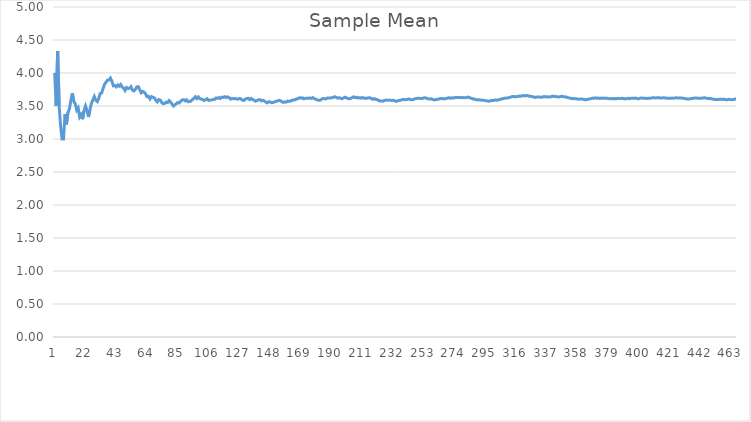
| Category | Series 0 |
|---|---|
| 0 | 4 |
| 1 | 3.5 |
| 2 | 4.333 |
| 3 | 3.5 |
| 4 | 3.2 |
| 5 | 3 |
| 6 | 3 |
| 7 | 3.375 |
| 8 | 3.222 |
| 9 | 3.4 |
| 10 | 3.455 |
| 11 | 3.583 |
| 12 | 3.692 |
| 13 | 3.571 |
| 14 | 3.533 |
| 15 | 3.438 |
| 16 | 3.471 |
| 17 | 3.333 |
| 18 | 3.368 |
| 19 | 3.3 |
| 20 | 3.429 |
| 21 | 3.5 |
| 22 | 3.435 |
| 23 | 3.333 |
| 24 | 3.44 |
| 25 | 3.538 |
| 26 | 3.593 |
| 27 | 3.643 |
| 28 | 3.586 |
| 29 | 3.567 |
| 30 | 3.613 |
| 31 | 3.688 |
| 32 | 3.697 |
| 33 | 3.765 |
| 34 | 3.829 |
| 35 | 3.861 |
| 36 | 3.892 |
| 37 | 3.895 |
| 38 | 3.923 |
| 39 | 3.875 |
| 40 | 3.805 |
| 41 | 3.81 |
| 42 | 3.791 |
| 43 | 3.818 |
| 44 | 3.8 |
| 45 | 3.826 |
| 46 | 3.787 |
| 47 | 3.771 |
| 48 | 3.735 |
| 49 | 3.78 |
| 50 | 3.765 |
| 51 | 3.769 |
| 52 | 3.792 |
| 53 | 3.741 |
| 54 | 3.727 |
| 55 | 3.75 |
| 56 | 3.789 |
| 57 | 3.793 |
| 58 | 3.746 |
| 59 | 3.7 |
| 60 | 3.721 |
| 61 | 3.71 |
| 62 | 3.683 |
| 63 | 3.641 |
| 64 | 3.646 |
| 65 | 3.606 |
| 66 | 3.642 |
| 67 | 3.632 |
| 68 | 3.623 |
| 69 | 3.586 |
| 70 | 3.563 |
| 71 | 3.597 |
| 72 | 3.589 |
| 73 | 3.554 |
| 74 | 3.533 |
| 75 | 3.539 |
| 76 | 3.558 |
| 77 | 3.551 |
| 78 | 3.582 |
| 79 | 3.562 |
| 80 | 3.531 |
| 81 | 3.5 |
| 82 | 3.518 |
| 83 | 3.536 |
| 84 | 3.553 |
| 85 | 3.547 |
| 86 | 3.575 |
| 87 | 3.591 |
| 88 | 3.596 |
| 89 | 3.578 |
| 90 | 3.593 |
| 91 | 3.565 |
| 92 | 3.57 |
| 93 | 3.574 |
| 94 | 3.6 |
| 95 | 3.615 |
| 96 | 3.639 |
| 97 | 3.612 |
| 98 | 3.636 |
| 99 | 3.61 |
| 100 | 3.604 |
| 101 | 3.598 |
| 102 | 3.583 |
| 103 | 3.596 |
| 104 | 3.61 |
| 105 | 3.585 |
| 106 | 3.589 |
| 107 | 3.593 |
| 108 | 3.596 |
| 109 | 3.6 |
| 110 | 3.622 |
| 111 | 3.616 |
| 112 | 3.628 |
| 113 | 3.614 |
| 114 | 3.635 |
| 115 | 3.629 |
| 116 | 3.641 |
| 117 | 3.627 |
| 118 | 3.639 |
| 119 | 3.625 |
| 120 | 3.603 |
| 121 | 3.615 |
| 122 | 3.61 |
| 123 | 3.613 |
| 124 | 3.608 |
| 125 | 3.603 |
| 126 | 3.614 |
| 127 | 3.609 |
| 128 | 3.589 |
| 129 | 3.585 |
| 130 | 3.603 |
| 131 | 3.614 |
| 132 | 3.617 |
| 133 | 3.597 |
| 134 | 3.615 |
| 135 | 3.596 |
| 136 | 3.591 |
| 137 | 3.572 |
| 138 | 3.583 |
| 139 | 3.593 |
| 140 | 3.596 |
| 141 | 3.577 |
| 142 | 3.587 |
| 143 | 3.576 |
| 144 | 3.559 |
| 145 | 3.548 |
| 146 | 3.565 |
| 147 | 3.561 |
| 148 | 3.55 |
| 149 | 3.553 |
| 150 | 3.563 |
| 151 | 3.572 |
| 152 | 3.575 |
| 153 | 3.584 |
| 154 | 3.581 |
| 155 | 3.564 |
| 156 | 3.554 |
| 157 | 3.563 |
| 158 | 3.56 |
| 159 | 3.575 |
| 160 | 3.571 |
| 161 | 3.574 |
| 162 | 3.589 |
| 163 | 3.591 |
| 164 | 3.594 |
| 165 | 3.608 |
| 166 | 3.611 |
| 167 | 3.625 |
| 168 | 3.621 |
| 169 | 3.624 |
| 170 | 3.608 |
| 171 | 3.616 |
| 172 | 3.618 |
| 173 | 3.615 |
| 174 | 3.623 |
| 175 | 3.614 |
| 176 | 3.627 |
| 177 | 3.612 |
| 178 | 3.603 |
| 179 | 3.594 |
| 180 | 3.586 |
| 181 | 3.588 |
| 182 | 3.601 |
| 183 | 3.614 |
| 184 | 3.611 |
| 185 | 3.608 |
| 186 | 3.62 |
| 187 | 3.622 |
| 188 | 3.619 |
| 189 | 3.626 |
| 190 | 3.628 |
| 191 | 3.641 |
| 192 | 3.632 |
| 193 | 3.619 |
| 194 | 3.626 |
| 195 | 3.617 |
| 196 | 3.609 |
| 197 | 3.621 |
| 198 | 3.633 |
| 199 | 3.625 |
| 200 | 3.612 |
| 201 | 3.609 |
| 202 | 3.616 |
| 203 | 3.627 |
| 204 | 3.639 |
| 205 | 3.626 |
| 206 | 3.633 |
| 207 | 3.62 |
| 208 | 3.627 |
| 209 | 3.619 |
| 210 | 3.63 |
| 211 | 3.618 |
| 212 | 3.62 |
| 213 | 3.617 |
| 214 | 3.623 |
| 215 | 3.625 |
| 216 | 3.613 |
| 217 | 3.601 |
| 218 | 3.612 |
| 219 | 3.6 |
| 220 | 3.597 |
| 221 | 3.586 |
| 222 | 3.574 |
| 223 | 3.576 |
| 224 | 3.573 |
| 225 | 3.584 |
| 226 | 3.59 |
| 227 | 3.588 |
| 228 | 3.59 |
| 229 | 3.587 |
| 230 | 3.584 |
| 231 | 3.586 |
| 232 | 3.579 |
| 233 | 3.568 |
| 234 | 3.579 |
| 235 | 3.585 |
| 236 | 3.586 |
| 237 | 3.597 |
| 238 | 3.598 |
| 239 | 3.596 |
| 240 | 3.598 |
| 241 | 3.603 |
| 242 | 3.605 |
| 243 | 3.594 |
| 244 | 3.596 |
| 245 | 3.602 |
| 246 | 3.611 |
| 247 | 3.613 |
| 248 | 3.618 |
| 249 | 3.616 |
| 250 | 3.614 |
| 251 | 3.615 |
| 252 | 3.625 |
| 253 | 3.622 |
| 254 | 3.616 |
| 255 | 3.605 |
| 256 | 3.607 |
| 257 | 3.609 |
| 258 | 3.598 |
| 259 | 3.592 |
| 260 | 3.598 |
| 261 | 3.599 |
| 262 | 3.605 |
| 263 | 3.614 |
| 264 | 3.611 |
| 265 | 3.613 |
| 266 | 3.607 |
| 267 | 3.616 |
| 268 | 3.617 |
| 269 | 3.626 |
| 270 | 3.616 |
| 271 | 3.625 |
| 272 | 3.619 |
| 273 | 3.628 |
| 274 | 3.629 |
| 275 | 3.63 |
| 276 | 3.628 |
| 277 | 3.626 |
| 278 | 3.631 |
| 279 | 3.625 |
| 280 | 3.626 |
| 281 | 3.628 |
| 282 | 3.636 |
| 283 | 3.627 |
| 284 | 3.618 |
| 285 | 3.612 |
| 286 | 3.603 |
| 287 | 3.601 |
| 288 | 3.592 |
| 289 | 3.597 |
| 290 | 3.591 |
| 291 | 3.589 |
| 292 | 3.587 |
| 293 | 3.588 |
| 294 | 3.58 |
| 295 | 3.578 |
| 296 | 3.572 |
| 297 | 3.577 |
| 298 | 3.582 |
| 299 | 3.583 |
| 300 | 3.588 |
| 301 | 3.593 |
| 302 | 3.587 |
| 303 | 3.595 |
| 304 | 3.6 |
| 305 | 3.608 |
| 306 | 3.612 |
| 307 | 3.617 |
| 308 | 3.621 |
| 309 | 3.623 |
| 310 | 3.627 |
| 311 | 3.635 |
| 312 | 3.642 |
| 313 | 3.643 |
| 314 | 3.638 |
| 315 | 3.646 |
| 316 | 3.644 |
| 317 | 3.651 |
| 318 | 3.649 |
| 319 | 3.653 |
| 320 | 3.66 |
| 321 | 3.652 |
| 322 | 3.659 |
| 323 | 3.654 |
| 324 | 3.646 |
| 325 | 3.647 |
| 326 | 3.639 |
| 327 | 3.637 |
| 328 | 3.629 |
| 329 | 3.636 |
| 330 | 3.634 |
| 331 | 3.636 |
| 332 | 3.631 |
| 333 | 3.638 |
| 334 | 3.645 |
| 335 | 3.637 |
| 336 | 3.641 |
| 337 | 3.636 |
| 338 | 3.637 |
| 339 | 3.644 |
| 340 | 3.648 |
| 341 | 3.643 |
| 342 | 3.644 |
| 343 | 3.637 |
| 344 | 3.638 |
| 345 | 3.642 |
| 346 | 3.648 |
| 347 | 3.641 |
| 348 | 3.642 |
| 349 | 3.634 |
| 350 | 3.627 |
| 351 | 3.622 |
| 352 | 3.618 |
| 353 | 3.61 |
| 354 | 3.614 |
| 355 | 3.61 |
| 356 | 3.611 |
| 357 | 3.603 |
| 358 | 3.604 |
| 359 | 3.606 |
| 360 | 3.604 |
| 361 | 3.599 |
| 362 | 3.592 |
| 363 | 3.599 |
| 364 | 3.603 |
| 365 | 3.607 |
| 366 | 3.613 |
| 367 | 3.62 |
| 368 | 3.618 |
| 369 | 3.624 |
| 370 | 3.617 |
| 371 | 3.621 |
| 372 | 3.614 |
| 373 | 3.62 |
| 374 | 3.616 |
| 375 | 3.62 |
| 376 | 3.615 |
| 377 | 3.616 |
| 378 | 3.612 |
| 379 | 3.611 |
| 380 | 3.614 |
| 381 | 3.607 |
| 382 | 3.614 |
| 383 | 3.609 |
| 384 | 3.616 |
| 385 | 3.614 |
| 386 | 3.615 |
| 387 | 3.616 |
| 388 | 3.614 |
| 389 | 3.608 |
| 390 | 3.611 |
| 391 | 3.617 |
| 392 | 3.611 |
| 393 | 3.617 |
| 394 | 3.618 |
| 395 | 3.619 |
| 396 | 3.62 |
| 397 | 3.616 |
| 398 | 3.609 |
| 399 | 3.615 |
| 400 | 3.621 |
| 401 | 3.619 |
| 402 | 3.618 |
| 403 | 3.619 |
| 404 | 3.612 |
| 405 | 3.618 |
| 406 | 3.617 |
| 407 | 3.62 |
| 408 | 3.626 |
| 409 | 3.627 |
| 410 | 3.62 |
| 411 | 3.626 |
| 412 | 3.627 |
| 413 | 3.621 |
| 414 | 3.619 |
| 415 | 3.625 |
| 416 | 3.624 |
| 417 | 3.62 |
| 418 | 3.618 |
| 419 | 3.617 |
| 420 | 3.615 |
| 421 | 3.621 |
| 422 | 3.617 |
| 423 | 3.62 |
| 424 | 3.626 |
| 425 | 3.62 |
| 426 | 3.623 |
| 427 | 3.621 |
| 428 | 3.62 |
| 429 | 3.616 |
| 430 | 3.613 |
| 431 | 3.606 |
| 432 | 3.607 |
| 433 | 3.606 |
| 434 | 3.611 |
| 435 | 3.615 |
| 436 | 3.618 |
| 437 | 3.621 |
| 438 | 3.62 |
| 439 | 3.618 |
| 440 | 3.617 |
| 441 | 3.615 |
| 442 | 3.621 |
| 443 | 3.624 |
| 444 | 3.622 |
| 445 | 3.617 |
| 446 | 3.611 |
| 447 | 3.616 |
| 448 | 3.61 |
| 449 | 3.604 |
| 450 | 3.601 |
| 451 | 3.597 |
| 452 | 3.598 |
| 453 | 3.599 |
| 454 | 3.604 |
| 455 | 3.599 |
| 456 | 3.604 |
| 457 | 3.6 |
| 458 | 3.595 |
| 459 | 3.596 |
| 460 | 3.601 |
| 461 | 3.6 |
| 462 | 3.594 |
| 463 | 3.599 |
| 464 | 3.604 |
| 465 | 3.607 |